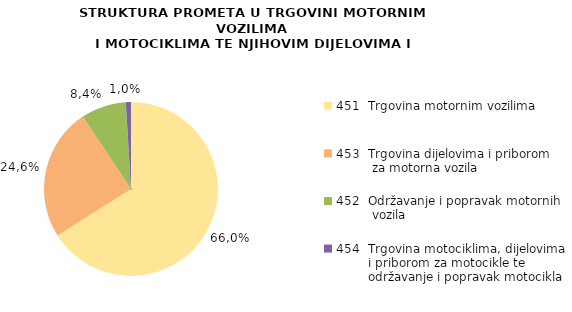
| Category | Series 0 |
|---|---|
| 451  Trgovina motornim vozilima  | 66.015 |
| 453  Trgovina dijelovima i priborom 
         za motorna vozila | 24.624 |
| 452  Održavanje i popravak motornih 
         vozila | 8.398 |
| 454  Trgovina motociklima, dijelovima 
        i priborom za motocikle te 
        održavanje i popravak motocikla | 0.963 |